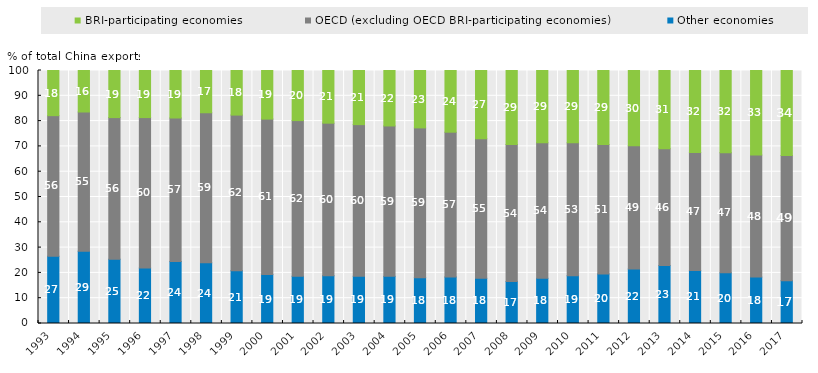
| Category | Other economies | OECD (excluding OECD BRI-participating economies) | BRI-participating economies |
|---|---|---|---|
| 1993.0 | 26.624 | 55.534 | 17.842 |
| 1994.0 | 28.517 | 55.08 | 16.404 |
| 1995.0 | 25.382 | 56.004 | 18.614 |
| 1996.0 | 21.936 | 59.45 | 18.614 |
| 1997.0 | 24.522 | 56.704 | 18.774 |
| 1998.0 | 23.982 | 59.31 | 16.708 |
| 1999.0 | 20.878 | 61.498 | 17.624 |
| 2000.0 | 19.33 | 61.465 | 19.206 |
| 2001.0 | 18.684 | 61.516 | 19.801 |
| 2002.0 | 18.917 | 60.268 | 20.815 |
| 2003.0 | 18.675 | 59.933 | 21.393 |
| 2004.0 | 18.63 | 59.45 | 21.92 |
| 2005.0 | 18.103 | 59.216 | 22.682 |
| 2006.0 | 18.39 | 57.225 | 24.385 |
| 2007.0 | 17.862 | 55.195 | 26.943 |
| 2008.0 | 16.57 | 54.209 | 29.221 |
| 2009.0 | 17.856 | 53.552 | 28.593 |
| 2010.0 | 18.893 | 52.592 | 28.514 |
| 2011.0 | 19.589 | 51.183 | 29.229 |
| 2012.0 | 21.534 | 48.73 | 29.736 |
| 2013.0 | 22.889 | 46.212 | 30.899 |
| 2014.0 | 20.949 | 46.599 | 32.453 |
| 2015.0 | 20.013 | 47.482 | 32.506 |
| 2016.0 | 18.34 | 48.263 | 33.396 |
| 2017.0 | 16.915 | 49.462 | 33.624 |